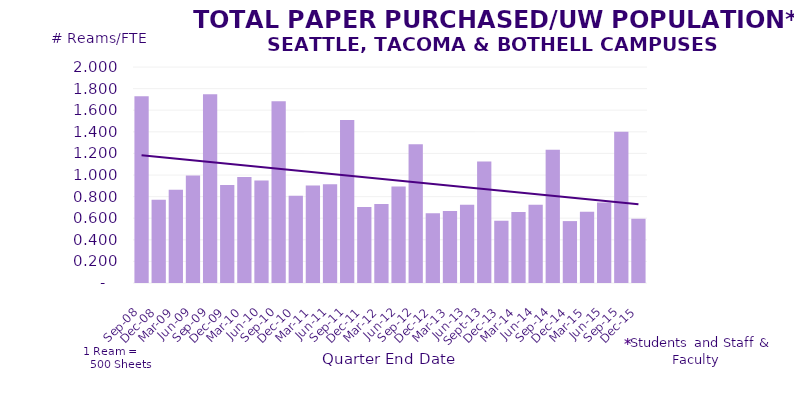
| Category | Series 1 |
|---|---|
| Sep-08 | 1.728 |
| Dec-08 | 0.77 |
| Mar-09 | 0.864 |
| Jun-09 | 0.996 |
| Sep-09 | 1.749 |
| Dec-09 | 0.907 |
| Mar-10 | 0.981 |
| Jun-10 | 0.948 |
| Sep-10 | 1.682 |
| Dec-10 | 0.808 |
| Mar-11 | 0.904 |
| Jun-11 | 0.914 |
| Sep-11 | 1.51 |
| Dec-11 | 0.703 |
| Mar-12 | 0.731 |
| Jun-12 | 0.894 |
| Sep-12 | 1.284 |
| Dec-12 | 0.646 |
| Mar-13 | 0.667 |
| Jun-13 | 0.724 |
| Sep-13 | 1.126 |
| Dec-13 | 0.576 |
| Mar-14 | 0.658 |
| Jun-14 | 0.725 |
| Sep-14 | 1.233 |
| Dec-14 | 0.573 |
| Mar-15 | 0.659 |
| Jun-15 | 0.745 |
| Sep-15 | 1.4 |
| Dec-15 | 0.594 |